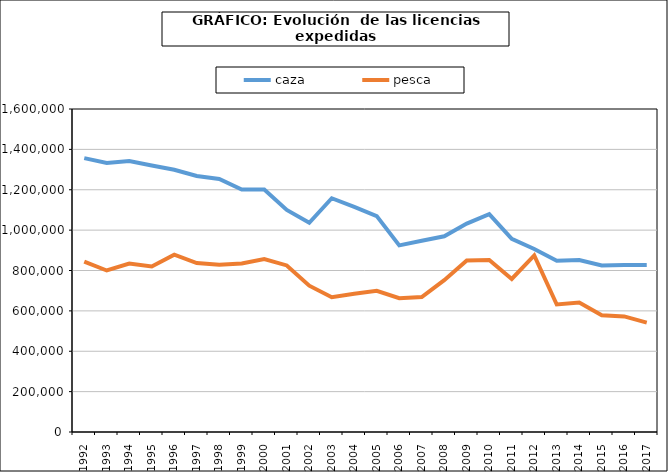
| Category | caza | pesca |
|---|---|---|
| 1992.0 | 1356553 | 844299 |
| 1993.0 | 1332252 | 799990 |
| 1994.0 | 1342603 | 834085 |
| 1995.0 | 1320315 | 820252 |
| 1996.0 | 1298860 | 878282 |
| 1997.0 | 1268057 | 837092 |
| 1998.0 | 1253105 | 829083 |
| 1999.0 | 1200951 | 834680 |
| 2000.0 | 1200875 | 856450 |
| 2001.0 | 1099856 | 825020 |
| 2002.0 | 1036340 | 724800 |
| 2003.0 | 1157969 | 667655 |
| 2004.0 | 1115000 | 685000 |
| 2005.0 | 1069804 | 699078 |
| 2006.0 | 924524 | 663000 |
| 2007.0 | 946965 | 668685 |
| 2008.0 | 969298 | 751937 |
| 2009.0 | 1032242 | 849102 |
| 2010.0 | 1078852 | 851759 |
| 2011.0 | 957191 | 758018 |
| 2012.0 | 906437 | 874802 |
| 2013.0 | 848243 | 631643 |
| 2014.0 | 851894 | 641819 |
| 2015.0 | 825374 | 578707 |
| 2016.0 | 826777 | 572495 |
| 2017.0 | 827776 | 541877 |